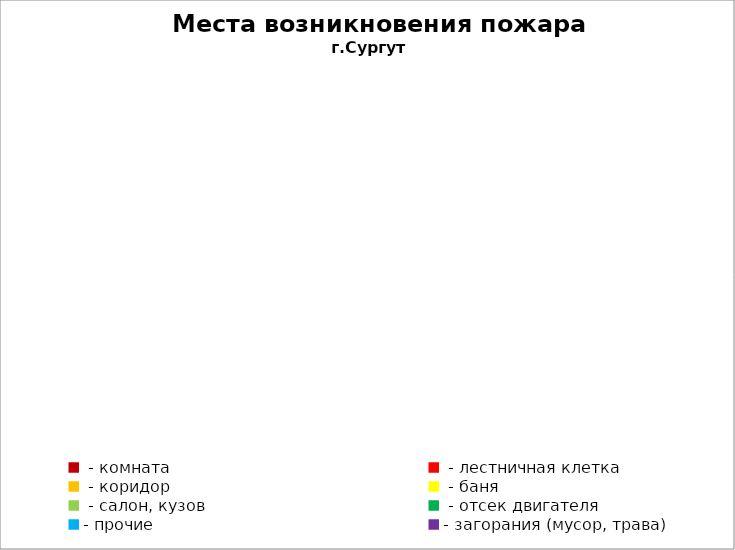
| Category | Места возникновения пожара |
|---|---|
|  - комната | 80 |
|  - лестничная клетка | 13 |
|  - коридор | 7 |
|  - баня | 45 |
|  - салон, кузов | 21 |
|  - отсек двигателя | 54 |
| - прочие | 144 |
| - загорания (мусор, трава)  | 133 |